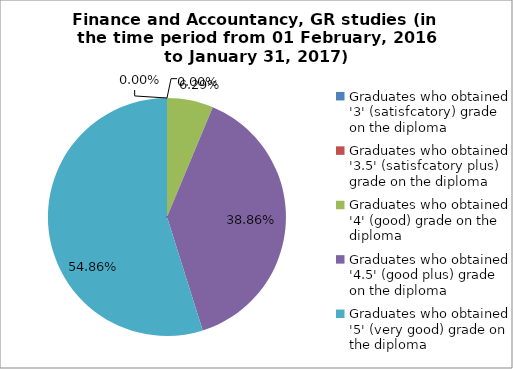
| Category | Series 1 |
|---|---|
| Graduates who obtained '3' (satisfcatory) grade on the diploma | 0 |
| Graduates who obtained '3.5' (satisfcatory plus) grade on the diploma | 0 |
| Graduates who obtained '4' (good) grade on the diploma | 6.286 |
| Graduates who obtained '4.5' (good plus) grade on the diploma | 38.857 |
| Graduates who obtained '5' (very good) grade on the diploma | 54.857 |